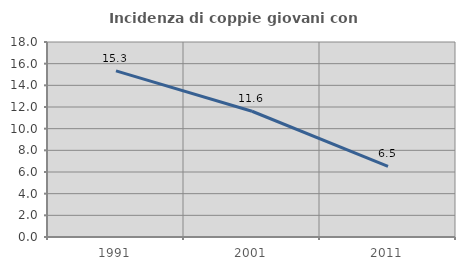
| Category | Incidenza di coppie giovani con figli |
|---|---|
| 1991.0 | 15.332 |
| 2001.0 | 11.609 |
| 2011.0 | 6.528 |